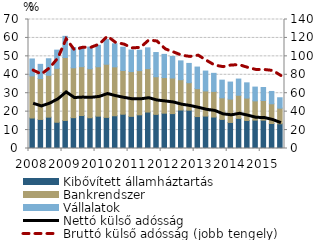
| Category | Kibővített államháztartás | Bankrendszer | Vállalatok |
|---|---|---|---|
| 2008.0 | 16.55 | 22.844 | 9.191 |
| 2008.0 | 15.766 | 22.179 | 7.719 |
| 2008.0 | 17.007 | 22.712 | 8.98 |
| 2008.0 | 14.246 | 29.259 | 9.867 |
| 2009.0 | 15.21 | 34.154 | 11.496 |
| 2009.0 | 16.735 | 27.065 | 10.981 |
| 2009.0 | 17.914 | 26.501 | 10.83 |
| 2009.0 | 16.675 | 26.59 | 11.753 |
| 2010.0 | 17.55 | 26.815 | 11.633 |
| 2010.0 | 16.894 | 28.851 | 13.352 |
| 2010.0 | 17.766 | 26.539 | 12.517 |
| 2010.0 | 18.606 | 23.75 | 12.61 |
| 2011.0 | 17.436 | 24.288 | 11.704 |
| 2011.0 | 18.274 | 23.983 | 11.067 |
| 2011.0 | 19.774 | 23.555 | 11.29 |
| 2011.0 | 18.508 | 20.429 | 13.138 |
| 2012.0 | 19.179 | 19.318 | 12.578 |
| 2012.0 | 18.933 | 19.324 | 11.677 |
| 2012.0 | 20.862 | 16.469 | 10.216 |
| 2012.0 | 20.781 | 14.923 | 10.463 |
| 2013.0 | 17.333 | 15.148 | 11.709 |
| 2013.0 | 17.602 | 13.643 | 10.775 |
| 2013.0 | 17.076 | 13.896 | 9.811 |
| 2013.0 | 15.786 | 11.721 | 9.576 |
| 2014.0 | 14.132 | 12.679 | 9.236 |
| 2014.0 | 16.357 | 12.531 | 8.788 |
| 2014.0 | 15.198 | 12.164 | 8.268 |
| 2014.0 | 15.395 | 10.451 | 7.476 |
| 2015.0 | 15.372 | 10.691 | 7.03 |
| 2015.0 | 13.573 | 10.694 | 6.688 |
| 2015.0 | 13.426 | 8.473 | 5.634 |